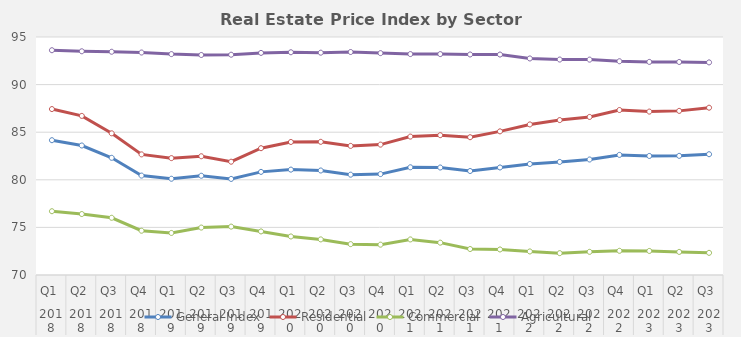
| Category | General Index | Residential | Commercial | Agricultural |
|---|---|---|---|---|
| 0 | 84.16 | 87.43 | 76.7 | 93.61 |
| 1 | 83.603 | 86.713 | 76.403 | 93.5 |
| 2 | 82.31 | 84.883 | 76.01 | 93.45 |
| 3 | 80.443 | 82.67 | 74.65 | 93.37 |
| 4 | 80.11 | 82.277 | 74.417 | 93.203 |
| 5 | 80.427 | 82.473 | 74.983 | 93.11 |
| 6 | 80.093 | 81.9 | 75.083 | 93.14 |
| 7 | 80.833 | 83.32 | 74.577 | 93.33 |
| 8 | 81.07 | 83.973 | 74.047 | 93.397 |
| 9 | 80.977 | 83.99 | 73.74 | 93.353 |
| 10 | 80.538 | 83.562 | 73.242 | 93.424 |
| 11 | 80.6 | 83.696 | 73.187 | 93.307 |
| 12 | 81.315 | 84.54 | 73.736 | 93.206 |
| 13 | 81.291 | 84.687 | 73.398 | 93.204 |
| 14 | 80.925 | 84.473 | 72.728 | 93.164 |
| 15 | 81.295 | 85.089 | 72.682 | 93.157 |
| 16 | 81.662 | 85.816 | 72.474 | 92.745 |
| 17 | 81.879 | 86.272 | 72.295 | 92.633 |
| 18 | 82.132 | 86.603 | 72.433 | 92.625 |
| 19 | 82.616 | 87.33 | 72.541 | 92.453 |
| 20 | 82.506 | 87.165 | 72.527 | 92.384 |
| 21 | 82.516 | 87.24 | 72.425 | 92.376 |
| 22 | 82.687 | 87.574 | 72.328 | 92.332 |